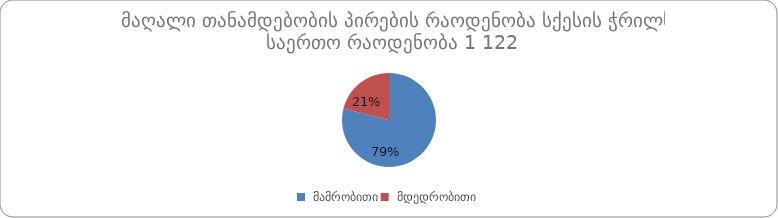
| Category | რაოდენობა |
|---|---|
|  მამრობითი | 890 |
|  მდედრობითი | 238 |